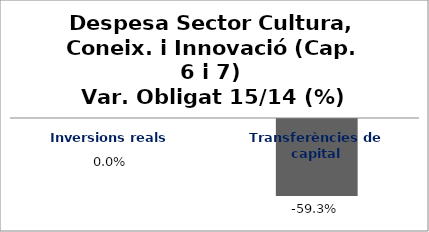
| Category | Series 0 |
|---|---|
| Inversions reals | 0 |
| Transferències de capital | -0.593 |